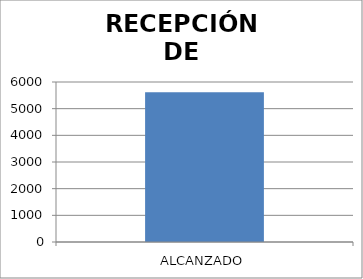
| Category | FOLIO |
|---|---|
| ALCANZADO | 5618 |